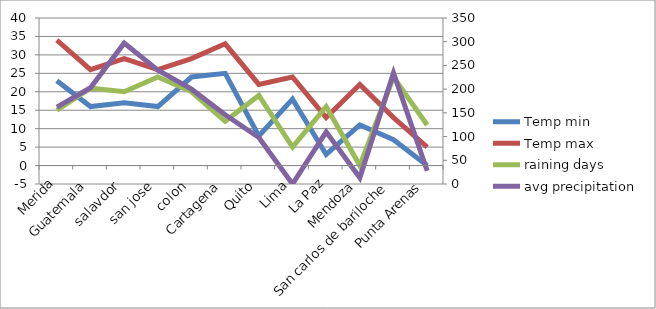
| Category | Temp min | Temp max | raining days |
|---|---|---|---|
| Merida | 23 | 34 | 15 |
| Guatemala | 16 | 26 | 21 |
| salavdor | 17 | 29 | 20 |
| san jose | 16 | 26 | 24 |
| colon | 24 | 29 | 20 |
| Cartagena | 25 | 33 | 12 |
| Quito | 8 | 22 | 19 |
| Lima | 18 | 24 | 5 |
| La Paz | 3 | 13 | 16 |
| Mendoza | 11 | 22 | 0 |
| San carlos de bariloche | 7 | 13 | 24 |
| Punta Arenas | 0 | 5 | 11 |